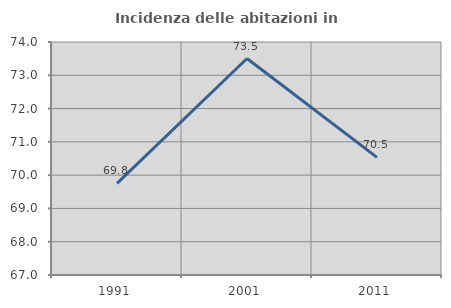
| Category | Incidenza delle abitazioni in proprietà  |
|---|---|
| 1991.0 | 69.754 |
| 2001.0 | 73.504 |
| 2011.0 | 70.534 |